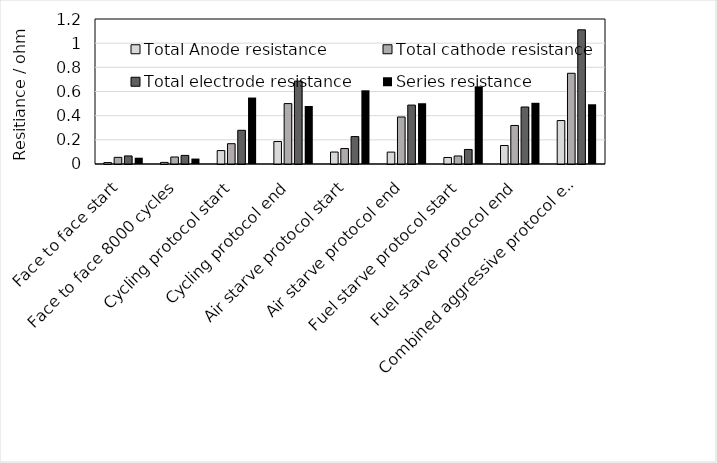
| Category | Total Anode resistance | Total cathode resistance | Total electrode resistance | Series resistance |
|---|---|---|---|---|
| Face to face start | 0.012 | 0.055 | 0.067 | 0.052 |
| Face to face 8000 cycles | 0.013 | 0.058 | 0.071 | 0.045 |
| Cycling protocol start | 0.111 | 0.168 | 0.279 | 0.55 |
| Cycling protocol end | 0.186 | 0.5 | 0.686 | 0.48 |
| Air starve protocol start | 0.099 | 0.128 | 0.227 | 0.61 |
| Air starve protocol end | 0.099 | 0.389 | 0.488 | 0.503 |
| Fuel starve protocol start | 0.054 | 0.066 | 0.12 | 0.643 |
| Fuel starve protocol end | 0.153 | 0.319 | 0.472 | 0.507 |
| Combined aggressive protocol end | 0.36 | 0.751 | 1.11 | 0.494 |